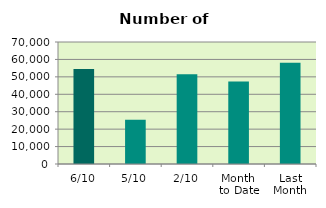
| Category | Series 0 |
|---|---|
| 6/10 | 54468 |
| 5/10 | 25370 |
| 2/10 | 51438 |
| Month 
to Date | 47320 |
| Last
Month | 58072.091 |